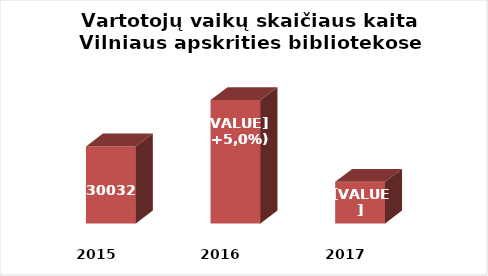
| Category | Series 0 |
|---|---|
| 2015.0 | 30032 |
| 2016.0 | 31559 |
| 2017.0 | 28869 |